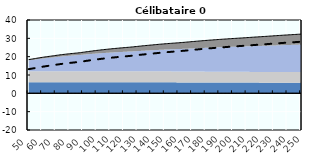
| Category | Coin fiscal moyen (somme des composantes) | Taux moyen d'imposition net en % du salaire brut |
|---|---|---|
| 50.0 | 18.416 | 13.195 |
| 51.0 | 18.52 | 13.306 |
| 52.0 | 18.649 | 13.443 |
| 53.0 | 18.773 | 13.574 |
| 54.0 | 18.876 | 13.684 |
| 55.0 | 19.025 | 13.842 |
| 56.0 | 19.138 | 13.963 |
| 57.0 | 19.277 | 14.11 |
| 58.0 | 19.41 | 14.253 |
| 59.0 | 19.511 | 14.36 |
| 60.0 | 19.637 | 14.494 |
| 61.0 | 19.758 | 14.623 |
| 62.0 | 19.849 | 14.719 |
| 63.0 | 19.963 | 14.841 |
| 64.0 | 20.073 | 14.958 |
| 65.0 | 20.155 | 15.045 |
| 66.0 | 20.26 | 15.156 |
| 67.0 | 20.365 | 15.268 |
| 68.0 | 20.442 | 15.351 |
| 69.0 | 20.568 | 15.485 |
| 70.0 | 20.691 | 15.615 |
| 71.0 | 20.783 | 15.713 |
| 72.0 | 20.873 | 15.809 |
| 73.0 | 20.986 | 15.929 |
| 74.0 | 21.071 | 16.019 |
| 75.0 | 21.178 | 16.134 |
| 76.0 | 21.258 | 16.219 |
| 77.0 | 21.336 | 16.301 |
| 78.0 | 21.436 | 16.408 |
| 79.0 | 21.509 | 16.486 |
| 80.0 | 21.581 | 16.562 |
| 81.0 | 21.674 | 16.661 |
| 82.0 | 21.742 | 16.734 |
| 83.0 | 21.808 | 16.804 |
| 84.0 | 21.896 | 16.897 |
| 85.0 | 21.959 | 16.964 |
| 86.0 | 22.042 | 17.053 |
| 87.0 | 22.118 | 17.133 |
| 88.0 | 22.201 | 17.222 |
| 89.0 | 22.325 | 17.354 |
| 90.0 | 22.423 | 17.458 |
| 91.0 | 22.518 | 17.559 |
| 92.0 | 22.637 | 17.686 |
| 93.0 | 22.728 | 17.782 |
| 94.0 | 22.821 | 17.882 |
| 95.0 | 22.939 | 18.007 |
| 96.0 | 23.029 | 18.103 |
| 97.0 | 23.117 | 18.196 |
| 98.0 | 23.228 | 18.315 |
| 99.0 | 23.312 | 18.404 |
| 100.0 | 23.419 | 18.518 |
| 101.0 | 23.5 | 18.604 |
| 102.0 | 23.579 | 18.688 |
| 103.0 | 23.68 | 18.796 |
| 104.0 | 23.756 | 18.877 |
| 105.0 | 23.831 | 18.956 |
| 106.0 | 23.927 | 19.058 |
| 107.0 | 23.998 | 19.134 |
| 108.0 | 24.068 | 19.209 |
| 109.0 | 24.16 | 19.306 |
| 110.0 | 24.227 | 19.378 |
| 111.0 | 24.315 | 19.471 |
| 112.0 | 24.38 | 19.54 |
| 113.0 | 24.444 | 19.608 |
| 114.0 | 24.528 | 19.697 |
| 115.0 | 24.589 | 19.763 |
| 116.0 | 24.649 | 19.827 |
| 117.0 | 24.729 | 19.912 |
| 118.0 | 24.787 | 19.973 |
| 119.0 | 24.844 | 20.034 |
| 120.0 | 24.92 | 20.115 |
| 121.0 | 24.975 | 20.174 |
| 122.0 | 25.05 | 20.253 |
| 123.0 | 25.103 | 20.309 |
| 124.0 | 25.16 | 20.37 |
| 125.0 | 25.245 | 20.461 |
| 126.0 | 25.308 | 20.528 |
| 127.0 | 25.371 | 20.594 |
| 128.0 | 25.467 | 20.697 |
| 129.0 | 25.54 | 20.774 |
| 130.0 | 25.611 | 20.85 |
| 131.0 | 25.703 | 20.948 |
| 132.0 | 25.772 | 21.022 |
| 133.0 | 25.862 | 21.117 |
| 134.0 | 25.929 | 21.188 |
| 135.0 | 25.995 | 21.259 |
| 136.0 | 26.081 | 21.35 |
| 137.0 | 26.145 | 21.418 |
| 138.0 | 26.208 | 21.485 |
| 139.0 | 26.29 | 21.573 |
| 140.0 | 26.351 | 21.638 |
| 141.0 | 26.412 | 21.702 |
| 142.0 | 26.491 | 21.786 |
| 143.0 | 26.569 | 21.87 |
| 144.0 | 26.627 | 21.931 |
| 145.0 | 26.703 | 22.012 |
| 146.0 | 26.778 | 22.092 |
| 147.0 | 26.832 | 22.15 |
| 148.0 | 26.899 | 22.224 |
| 149.0 | 26.965 | 22.297 |
| 150.0 | 27.011 | 22.349 |
| 151.0 | 27.075 | 22.42 |
| 152.0 | 27.139 | 22.49 |
| 153.0 | 27.201 | 22.559 |
| 154.0 | 27.244 | 22.608 |
| 155.0 | 27.306 | 22.676 |
| 156.0 | 27.366 | 22.743 |
| 157.0 | 27.407 | 22.789 |
| 158.0 | 27.466 | 22.855 |
| 159.0 | 27.524 | 22.919 |
| 160.0 | 27.564 | 22.964 |
| 161.0 | 27.632 | 23.039 |
| 162.0 | 27.7 | 23.113 |
| 163.0 | 27.766 | 23.186 |
| 164.0 | 27.814 | 23.239 |
| 165.0 | 27.884 | 23.316 |
| 166.0 | 27.959 | 23.398 |
| 167.0 | 28.014 | 23.459 |
| 168.0 | 28.088 | 23.54 |
| 169.0 | 28.161 | 23.619 |
| 170.0 | 28.233 | 23.698 |
| 171.0 | 28.285 | 23.756 |
| 172.0 | 28.355 | 23.833 |
| 173.0 | 28.425 | 23.909 |
| 174.0 | 28.475 | 23.964 |
| 175.0 | 28.543 | 24.039 |
| 176.0 | 28.61 | 24.112 |
| 177.0 | 28.659 | 24.166 |
| 178.0 | 28.725 | 24.238 |
| 179.0 | 28.79 | 24.309 |
| 180.0 | 28.854 | 24.38 |
| 181.0 | 28.9 | 24.43 |
| 182.0 | 28.963 | 24.499 |
| 183.0 | 29.026 | 24.568 |
| 184.0 | 29.07 | 24.616 |
| 185.0 | 29.131 | 24.683 |
| 186.0 | 29.192 | 24.75 |
| 187.0 | 29.252 | 24.815 |
| 188.0 | 29.294 | 24.862 |
| 189.0 | 29.353 | 24.926 |
| 190.0 | 29.411 | 24.989 |
| 191.0 | 29.452 | 25.034 |
| 192.0 | 29.509 | 25.096 |
| 193.0 | 29.565 | 25.158 |
| 194.0 | 29.604 | 25.201 |
| 195.0 | 29.66 | 25.262 |
| 196.0 | 29.714 | 25.322 |
| 197.0 | 29.769 | 25.381 |
| 198.0 | 29.806 | 25.422 |
| 199.0 | 29.859 | 25.481 |
| 200.0 | 29.912 | 25.538 |
| 201.0 | 29.948 | 25.578 |
| 202.0 | 30 | 25.635 |
| 203.0 | 30.051 | 25.691 |
| 204.0 | 30.102 | 25.746 |
| 205.0 | 30.137 | 25.784 |
| 206.0 | 30.186 | 25.839 |
| 207.0 | 30.236 | 25.892 |
| 208.0 | 30.273 | 25.933 |
| 209.0 | 30.33 | 25.996 |
| 210.0 | 30.387 | 26.058 |
| 211.0 | 30.427 | 26.101 |
| 212.0 | 30.483 | 26.162 |
| 213.0 | 30.538 | 26.222 |
| 214.0 | 30.593 | 26.282 |
| 215.0 | 30.631 | 26.324 |
| 216.0 | 30.685 | 26.382 |
| 217.0 | 30.739 | 26.44 |
| 218.0 | 30.776 | 26.481 |
| 219.0 | 30.828 | 26.538 |
| 220.0 | 30.88 | 26.594 |
| 221.0 | 30.932 | 26.65 |
| 222.0 | 30.967 | 26.689 |
| 223.0 | 31.018 | 26.744 |
| 224.0 | 31.075 | 26.806 |
| 225.0 | 31.117 | 26.852 |
| 226.0 | 31.174 | 26.914 |
| 227.0 | 31.231 | 26.976 |
| 228.0 | 31.272 | 27.02 |
| 229.0 | 31.328 | 27.08 |
| 230.0 | 31.383 | 27.141 |
| 231.0 | 31.438 | 27.2 |
| 232.0 | 31.477 | 27.242 |
| 233.0 | 31.531 | 27.301 |
| 234.0 | 31.585 | 27.359 |
| 235.0 | 31.623 | 27.4 |
| 236.0 | 31.676 | 27.458 |
| 237.0 | 31.728 | 27.514 |
| 238.0 | 31.78 | 27.571 |
| 239.0 | 31.816 | 27.61 |
| 240.0 | 31.868 | 27.666 |
| 241.0 | 31.918 | 27.721 |
| 242.0 | 31.953 | 27.759 |
| 243.0 | 32.004 | 27.813 |
| 244.0 | 32.053 | 27.867 |
| 245.0 | 32.087 | 27.904 |
| 246.0 | 32.136 | 27.957 |
| 247.0 | 32.185 | 28.009 |
| 248.0 | 32.233 | 28.061 |
| 249.0 | 32.266 | 28.097 |
| 250.0 | 32.313 | 28.149 |